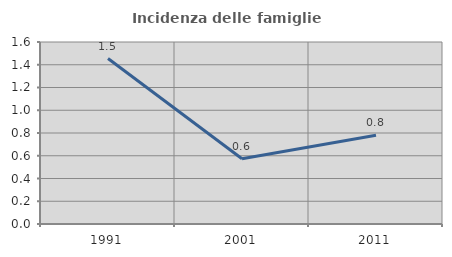
| Category | Incidenza delle famiglie numerose |
|---|---|
| 1991.0 | 1.454 |
| 2001.0 | 0.574 |
| 2011.0 | 0.78 |